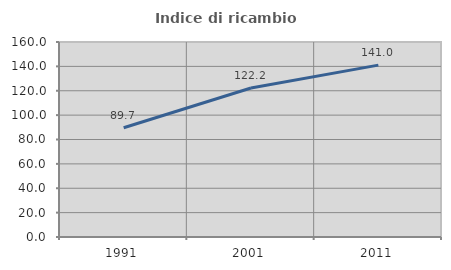
| Category | Indice di ricambio occupazionale  |
|---|---|
| 1991.0 | 89.655 |
| 2001.0 | 122.222 |
| 2011.0 | 141.026 |